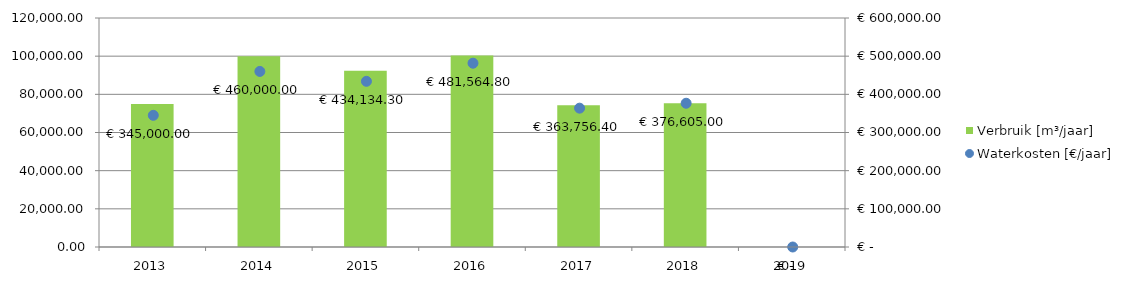
| Category | Verbruik [m³/jaar] |
|---|---|
| 2013.0 | 75000 |
| 2014.0 | 100000 |
| 2015.0 | 92369 |
| 2016.0 | 100326 |
| 2017.0 | 74236 |
| 2018.0 | 75321 |
| 2019.0 | 0 |